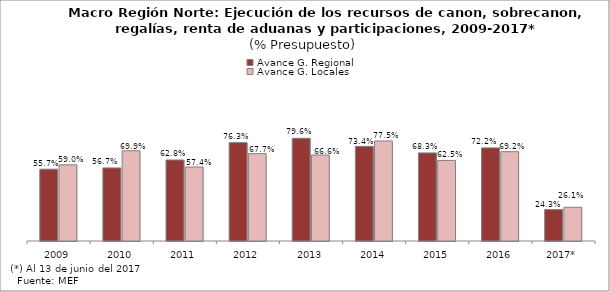
| Category | Avance G. Regional | Avance G. Locales |
|---|---|---|
| 2009 | 0.557 | 0.59 |
| 2010 | 0.567 | 0.699 |
| 2011 | 0.628 | 0.574 |
| 2012 | 0.763 | 0.677 |
| 2013 | 0.796 | 0.666 |
| 2014 | 0.734 | 0.775 |
| 2015 | 0.683 | 0.625 |
| 2016 | 0.722 | 0.692 |
| 2017* | 0.243 | 0.261 |